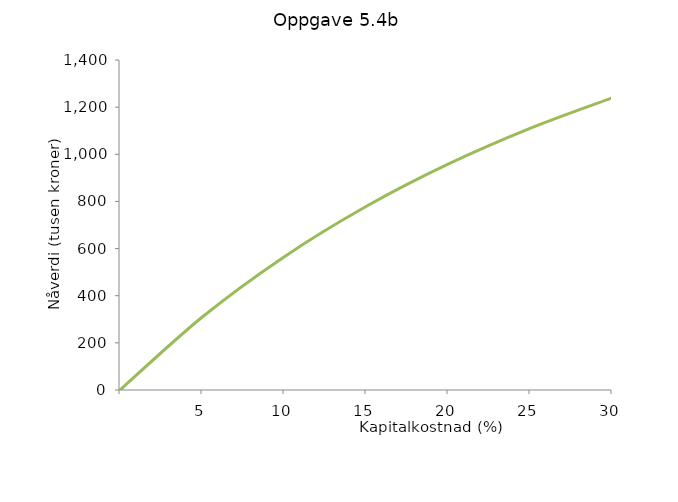
| Category | Arbeidskapital 30 % | Arbeidskapital 15 % | Differansekontantstrøm |
|---|---|---|---|
| nan |  |  | 0 |
| 5.0 |  |  | 308.627 |
| 10.0 |  |  | 564.494 |
| 15.000000000000002 |  |  | 778.204 |
| 20.0 |  |  | 957.9 |
| 25.0 |  |  | 1109.911 |
| 30.0 |  |  | 1239.203 |